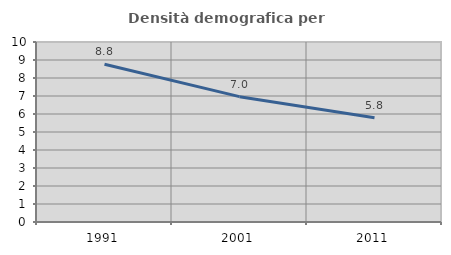
| Category | Densità demografica |
|---|---|
| 1991.0 | 8.768 |
| 2001.0 | 6.964 |
| 2011.0 | 5.789 |